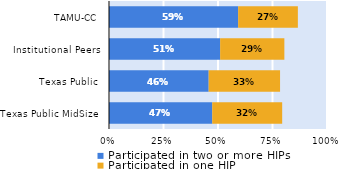
| Category | Participated in two or more HIPs | Participated in one HIP |
|---|---|---|
| Texas Public MidSize | 0.474 | 0.321 |
| Texas Public | 0.457 | 0.327 |
| Institutional Peers | 0.51 | 0.295 |
| TAMU-CC | 0.592 | 0.274 |